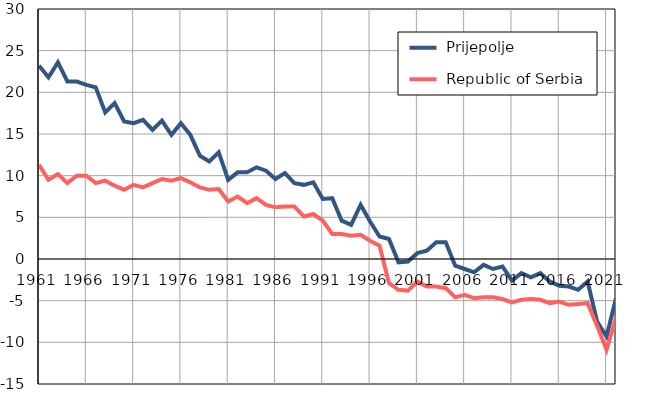
| Category |  Prijepolje |  Republic of Serbia |
|---|---|---|
| 1961.0 | 23.2 | 11.3 |
| 1962.0 | 21.8 | 9.5 |
| 1963.0 | 23.6 | 10.2 |
| 1964.0 | 21.3 | 9.1 |
| 1965.0 | 21.3 | 10 |
| 1966.0 | 20.9 | 10 |
| 1967.0 | 20.6 | 9.1 |
| 1968.0 | 17.6 | 9.4 |
| 1969.0 | 18.7 | 8.8 |
| 1970.0 | 16.5 | 8.3 |
| 1971.0 | 16.3 | 8.9 |
| 1972.0 | 16.7 | 8.6 |
| 1973.0 | 15.5 | 9.1 |
| 1974.0 | 16.6 | 9.6 |
| 1975.0 | 14.9 | 9.4 |
| 1976.0 | 16.3 | 9.7 |
| 1977.0 | 14.9 | 9.2 |
| 1978.0 | 12.4 | 8.6 |
| 1979.0 | 11.7 | 8.3 |
| 1980.0 | 12.8 | 8.4 |
| 1981.0 | 9.5 | 6.9 |
| 1982.0 | 10.4 | 7.5 |
| 1983.0 | 10.4 | 6.7 |
| 1984.0 | 11 | 7.3 |
| 1985.0 | 10.6 | 6.5 |
| 1986.0 | 9.6 | 6.2 |
| 1987.0 | 10.3 | 6.3 |
| 1988.0 | 9.1 | 6.3 |
| 1989.0 | 8.9 | 5.1 |
| 1990.0 | 9.2 | 5.4 |
| 1991.0 | 7.2 | 4.6 |
| 1992.0 | 7.3 | 3 |
| 1993.0 | 4.6 | 3 |
| 1994.0 | 4.1 | 2.8 |
| 1995.0 | 6.5 | 2.9 |
| 1996.0 | 4.5 | 2.2 |
| 1997.0 | 2.7 | 1.6 |
| 1998.0 | 2.4 | -2.9 |
| 1999.0 | -0.4 | -3.7 |
| 2000.0 | -0.3 | -3.8 |
| 2001.0 | 0.7 | -2.7 |
| 2002.0 | 1 | -3.3 |
| 2003.0 | 2 | -3.3 |
| 2004.0 | 2 | -3.5 |
| 2005.0 | -0.8 | -4.6 |
| 2006.0 | -1.2 | -4.3 |
| 2007.0 | -1.6 | -4.7 |
| 2008.0 | -0.7 | -4.6 |
| 2009.0 | -1.2 | -4.6 |
| 2010.0 | -0.9 | -4.8 |
| 2011.0 | -2.6 | -5.2 |
| 2012.0 | -1.7 | -4.9 |
| 2013.0 | -2.2 | -4.8 |
| 2014.0 | -1.7 | -4.9 |
| 2015.0 | -2.7 | -5.3 |
| 2016.0 | -3.2 | -5.1 |
| 2017.0 | -3.3 | -5.5 |
| 2018.0 | -3.7 | -5.4 |
| 2019.0 | -2.7 | -5.3 |
| 2020.0 | -7.5 | -8 |
| 2021.0 | -9.3 | -10.9 |
| 2022.0 | -4.7 | -7 |